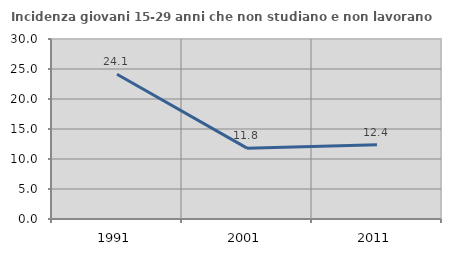
| Category | Incidenza giovani 15-29 anni che non studiano e non lavorano  |
|---|---|
| 1991.0 | 24.125 |
| 2001.0 | 11.808 |
| 2011.0 | 12.378 |